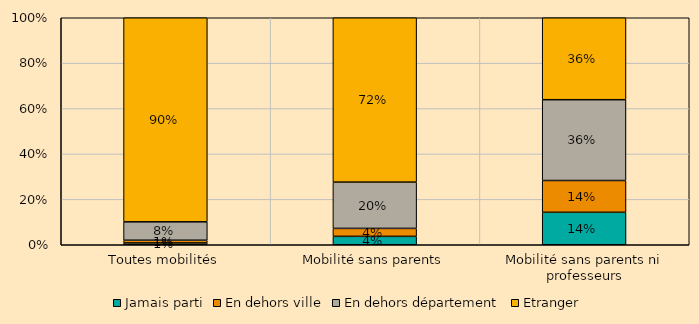
| Category | Jamais parti | En dehors ville | En dehors département | Etranger |
|---|---|---|---|---|
| Toutes mobilités | 0.008 | 0.012 | 0.081 | 0.899 |
| Mobilité sans parents | 0.037 | 0.035 | 0.204 | 0.724 |
| Mobilité sans parents ni professeurs | 0.143 | 0.14 | 0.356 | 0.361 |